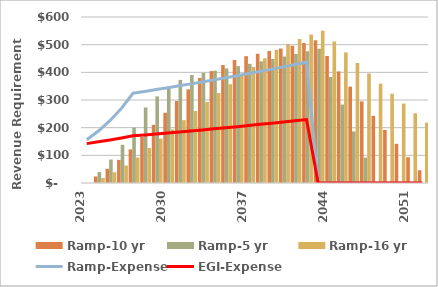
| Category | Ramp-10 yr | Ramp-5 yr | Ramp-16 yr |
|---|---|---|---|
| 2023.0 | 0 | 0 | 0 |
| 2024.0 | 23.663 | 39.312 | 17.795 |
| 2025.0 | 51.258 | 84.883 | 38.648 |
| 2026.0 | 83.569 | 137.966 | 63.171 |
| 2027.0 | 121.542 | 200.062 | 92.097 |
| 2028.0 | 166.308 | 272.974 | 126.308 |
| 2029.0 | 210.393 | 312.896 | 160.218 |
| 2030.0 | 253.784 | 346.434 | 193.821 |
| 2031.0 | 296.467 | 372.622 | 227.112 |
| 2032.0 | 338.428 | 390.308 | 260.083 |
| 2033.0 | 379.652 | 398.114 | 292.729 |
| 2034.0 | 404.476 | 406.076 | 325.043 |
| 2035.0 | 426.206 | 414.198 | 357.018 |
| 2036.0 | 444.36 | 422.482 | 388.648 |
| 2037.0 | 458.363 | 430.931 | 419.926 |
| 2038.0 | 467.531 | 439.55 | 450.844 |
| 2039.0 | 476.881 | 448.341 | 481.395 |
| 2040.0 | 486.419 | 457.308 | 501.793 |
| 2041.0 | 496.147 | 466.454 | 520.354 |
| 2042.0 | 506.07 | 475.783 | 536.779 |
| 2043.0 | 516.192 | 485.299 | 550.713 |
| 2044.0 | 459.156 | 383.099 | 511.072 |
| 2045.0 | 403.26 | 283.419 | 472.064 |
| 2046.0 | 348.529 | 186.308 | 433.702 |
| 2047.0 | 294.984 | 91.817 | 395.998 |
| 2048.0 | 242.649 | 0 | 358.966 |
| 2049.0 | 191.55 | 0 | 322.62 |
| 2050.0 | 141.71 | 0 | 286.972 |
| 2051.0 | 93.154 | 0 | 252.038 |
| 2052.0 | 45.909 | 0 | 217.83 |